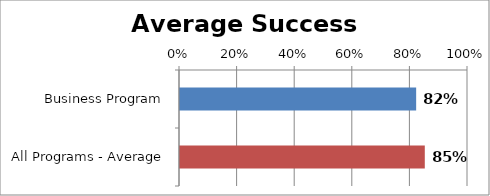
| Category | RetentionRate |
|---|---|
| Business Program | 0.82 |
| All Programs - Average | 0.85 |